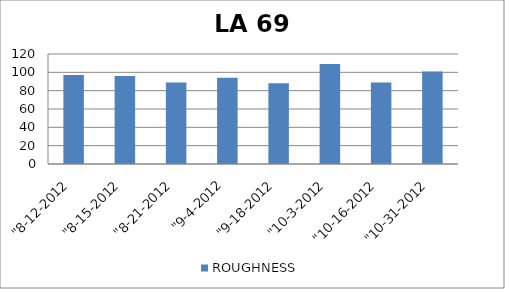
| Category | ROUGHNESS |
|---|---|
| "8-12-2012 | 97 |
| "8-15-2012 | 96 |
| "8-21-2012 | 89 |
| "9-4-2012 | 94 |
| "9-18-2012 | 88 |
| "10-3-2012 | 109 |
| "10-16-2012 | 89 |
| "10-31-2012 | 101 |